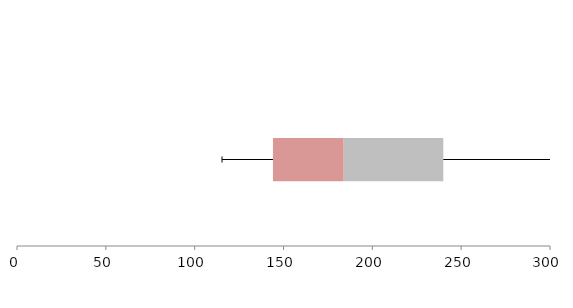
| Category | Series 1 | Series 2 | Series 3 |
|---|---|---|---|
| 0 | 144.067 | 39.824 | 56.056 |